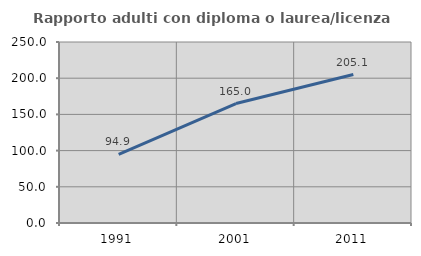
| Category | Rapporto adulti con diploma o laurea/licenza media  |
|---|---|
| 1991.0 | 94.906 |
| 2001.0 | 164.955 |
| 2011.0 | 205.1 |